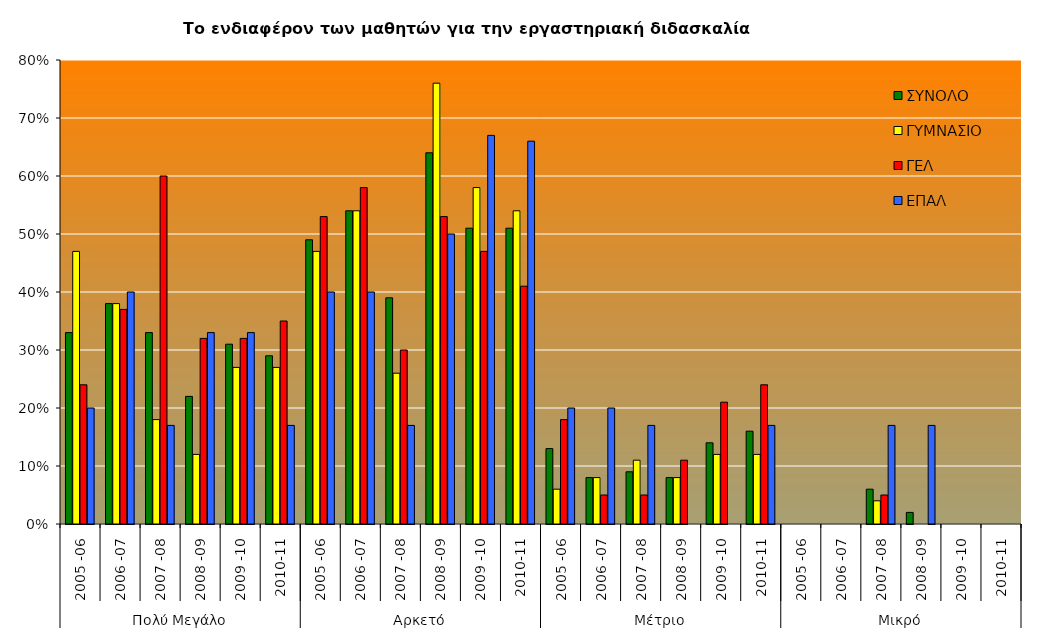
| Category | ΣΥΝΟΛΟ | ΓΥΜΝΑΣΙΟ | ΓΕΛ | ΕΠΑΛ |
|---|---|---|---|---|
| 0 | 0.33 | 0.47 | 0.24 | 0.2 |
| 1 | 0.38 | 0.38 | 0.37 | 0.4 |
| 2 | 0.33 | 0.18 | 0.6 | 0.17 |
| 3 | 0.22 | 0.12 | 0.32 | 0.33 |
| 4 | 0.31 | 0.27 | 0.32 | 0.33 |
| 5 | 0.29 | 0.27 | 0.35 | 0.17 |
| 6 | 0.49 | 0.47 | 0.53 | 0.4 |
| 7 | 0.54 | 0.54 | 0.58 | 0.4 |
| 8 | 0.39 | 0.26 | 0.3 | 0.17 |
| 9 | 0.64 | 0.76 | 0.53 | 0.5 |
| 10 | 0.51 | 0.58 | 0.47 | 0.67 |
| 11 | 0.51 | 0.54 | 0.41 | 0.66 |
| 12 | 0.13 | 0.06 | 0.18 | 0.2 |
| 13 | 0.08 | 0.08 | 0.05 | 0.2 |
| 14 | 0.09 | 0.11 | 0.05 | 0.17 |
| 15 | 0.08 | 0.08 | 0.11 | 0 |
| 16 | 0.14 | 0.12 | 0.21 | 0 |
| 17 | 0.16 | 0.12 | 0.24 | 0.17 |
| 18 | 0 | 0 | 0 | 0 |
| 19 | 0 | 0 | 0 | 0 |
| 20 | 0.06 | 0.04 | 0.05 | 0.17 |
| 21 | 0.02 | 0 | 0 | 0.17 |
| 22 | 0 | 0 | 0 | 0 |
| 23 | 0 | 0 | 0 | 0 |